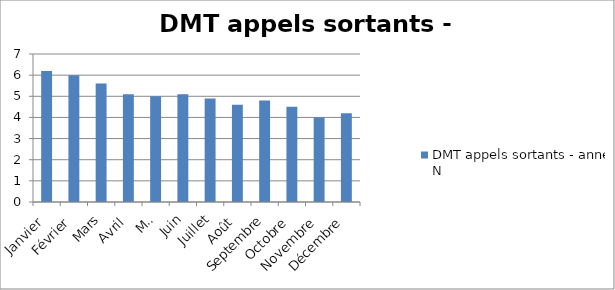
| Category | DMT appels sortants - année N |
|---|---|
| Janvier | 6.2 |
| Février | 6 |
| Mars | 5.6 |
| Avril | 5.1 |
| Mai | 5 |
| Juin | 5.1 |
| Juillet | 4.9 |
| Août | 4.6 |
| Septembre | 4.8 |
| Octobre | 4.5 |
| Novembre | 4 |
| Décembre | 4.2 |